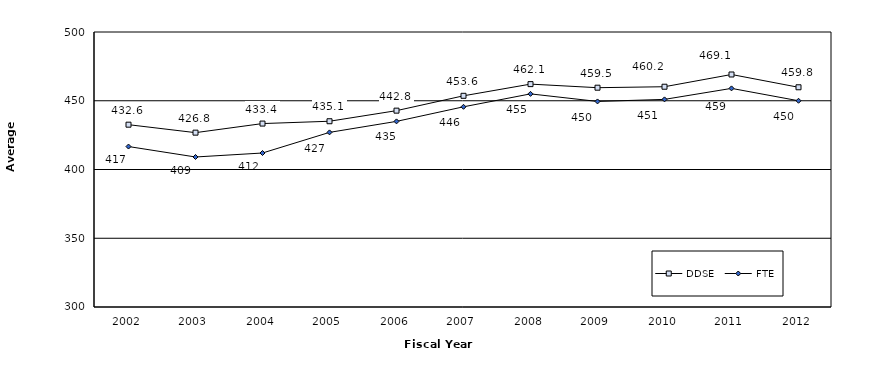
| Category | DDSE |
|---|---|
| 2002.0 | 432.6 |
| 2003.0 | 426.8 |
| 2004.0 | 433.4 |
| 2005.0 | 435.1 |
| 2006.0 | 442.8 |
| 2007.0 | 453.6 |
| 2008.0 | 462.1 |
| 2009.0 | 459.5 |
| 2010.0 | 460.2 |
| 2011.0 | 469.1 |
| 2012.0 | 459.8 |